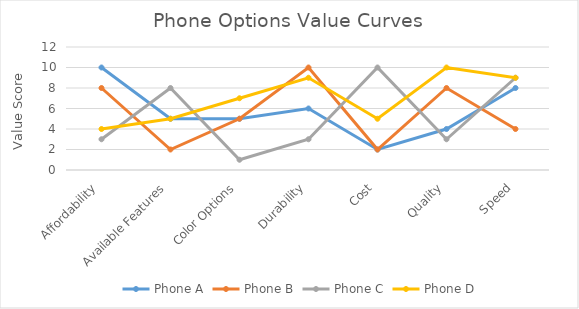
| Category | Phone A | Phone B | Phone C | Phone D |
|---|---|---|---|---|
| Affordability | 10 | 8 | 3 | 4 |
| Available Features | 5 | 2 | 8 | 5 |
| Color Options | 5 | 5 | 1 | 7 |
| Durability | 6 | 10 | 3 | 9 |
| Cost | 2 | 2 | 10 | 5 |
| Quality | 4 | 8 | 3 | 10 |
| Speed | 8 | 4 | 9 | 9 |